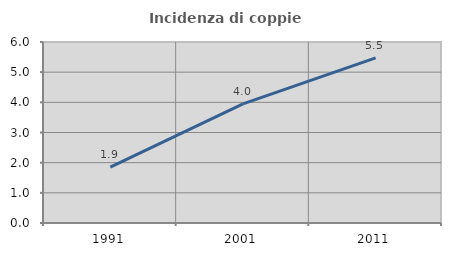
| Category | Incidenza di coppie miste |
|---|---|
| 1991.0 | 1.851 |
| 2001.0 | 3.951 |
| 2011.0 | 5.473 |